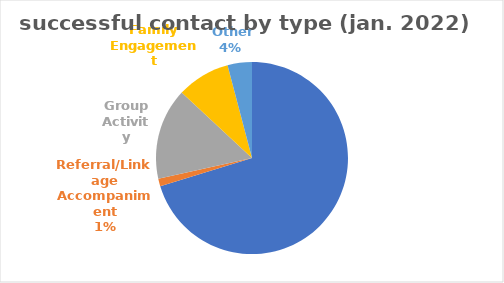
| Category | Series 0 |
|---|---|
| Individual Meeting | 274 |
| Referral/Linkage Accompaniment | 5 |
| Group Activity | 60 |
| Family Engagement | 35 |
|  Other | 16 |